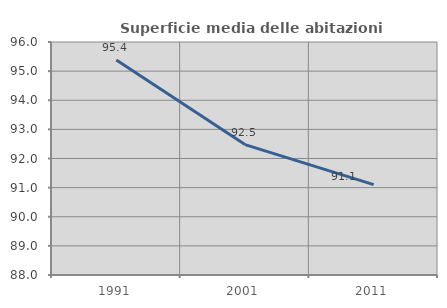
| Category | Superficie media delle abitazioni occupate |
|---|---|
| 1991.0 | 95.379 |
| 2001.0 | 92.477 |
| 2011.0 | 91.104 |